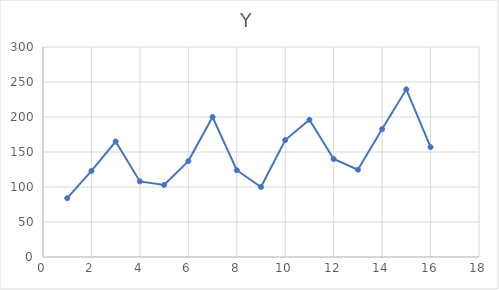
| Category | Y |
|---|---|
| 1.0 | 84 |
| 2.0 | 123 |
| 3.0 | 165 |
| 4.0 | 108 |
| 5.0 | 103 |
| 6.0 | 137 |
| 7.0 | 200 |
| 8.0 | 124 |
| 9.0 | 100 |
| 10.0 | 167 |
| 11.0 | 196 |
| 12.0 | 140 |
| 13.0 | 124.647 |
| 14.0 | 182.702 |
| 15.0 | 239.538 |
| 16.0 | 157.024 |